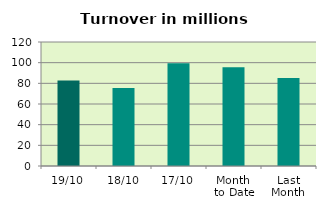
| Category | Series 0 |
|---|---|
| 19/10 | 82.66 |
| 18/10 | 75.534 |
| 17/10 | 99.353 |
| Month 
to Date | 95.548 |
| Last
Month | 85.072 |